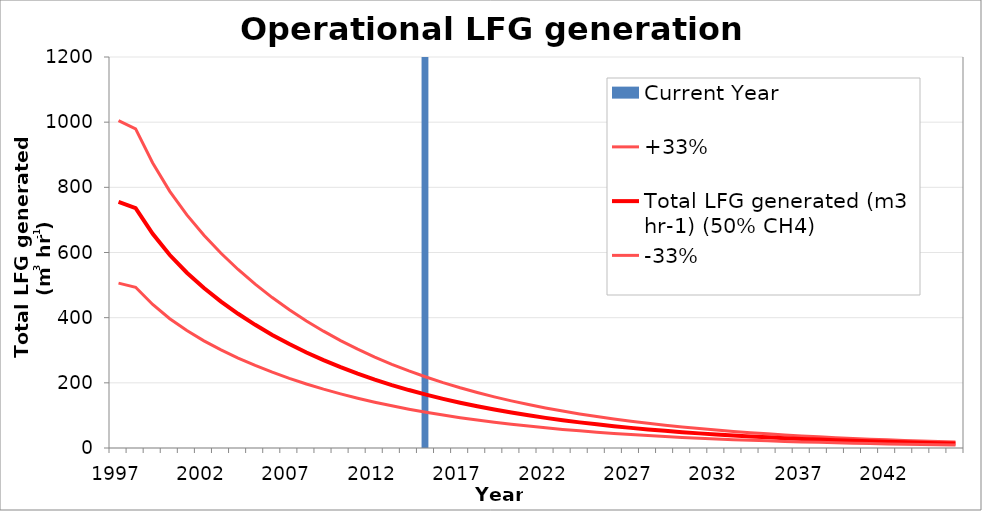
| Category | Current Year |
|---|---|
| 1997.0 | 0 |
| 1998.0 | 0 |
| 1999.0 | 0 |
| 2000.0 | 0 |
| 2001.0 | 0 |
| 2002.0 | 0 |
| 2003.0 | 0 |
| 2004.0 | 0 |
| 2005.0 | 0 |
| 2006.0 | 0 |
| 2007.0 | 0 |
| 2008.0 | 0 |
| 2009.0 | 0 |
| 2010.0 | 0 |
| 2011.0 | 0 |
| 2012.0 | 0 |
| 2013.0 | 0 |
| 2014.0 | 0 |
| 2015.0 | 1 |
| 2016.0 | 0 |
| 2017.0 | 0 |
| 2018.0 | 0 |
| 2019.0 | 0 |
| 2020.0 | 0 |
| 2021.0 | 0 |
| 2022.0 | 0 |
| 2023.0 | 0 |
| 2024.0 | 0 |
| 2025.0 | 0 |
| 2026.0 | 0 |
| 2027.0 | 0 |
| 2028.0 | 0 |
| 2029.0 | 0 |
| 2030.0 | 0 |
| 2031.0 | 0 |
| 2032.0 | 0 |
| 2033.0 | 0 |
| 2034.0 | 0 |
| 2035.0 | 0 |
| 2036.0 | 0 |
| 2037.0 | 0 |
| 2038.0 | 0 |
| 2039.0 | 0 |
| 2040.0 | 0 |
| 2041.0 | 0 |
| 2042.0 | 0 |
| 2043.0 | 0 |
| 2044.0 | 0 |
| 2045.0 | 0 |
| 2046.0 | 0 |